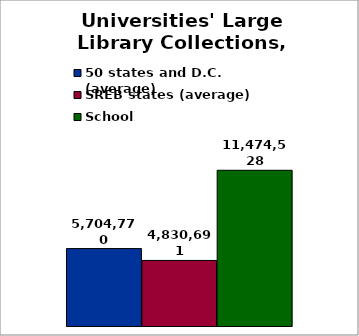
| Category | 50 states and D.C. (average) | SREB states (average) | School |
|---|---|---|---|
| 0 | 5704769.545 | 4830690.667 | 11474528 |